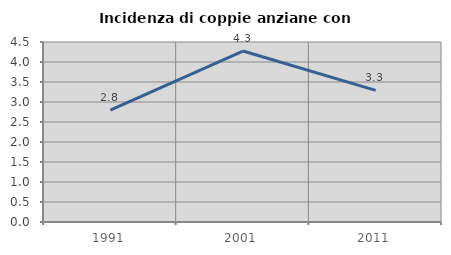
| Category | Incidenza di coppie anziane con figli |
|---|---|
| 1991.0 | 2.798 |
| 2001.0 | 4.275 |
| 2011.0 | 3.292 |